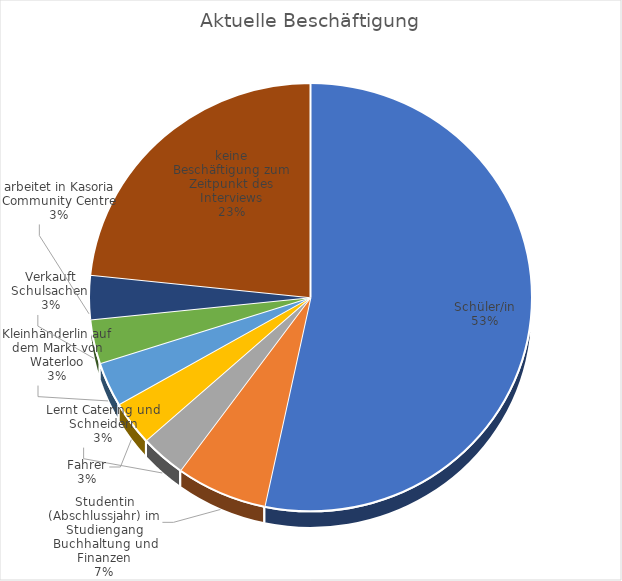
| Category | Series 0 |
|---|---|
| Schüler/in | 16 |
| Studentin (Abschlussjahr) im Studiengang Buchhaltung und Finanzen | 2 |
| Lernt Catering und Schneidern | 1 |
| Fahrer | 1 |
| Kleinhänderlin auf dem Markt von Waterloo | 1 |
| Verkauft Schulsachen  | 1 |
| arbeitet in Kasoria Community Centre | 1 |
| keine Beschäftigung zum Zeitpunkt des Interviews | 7 |